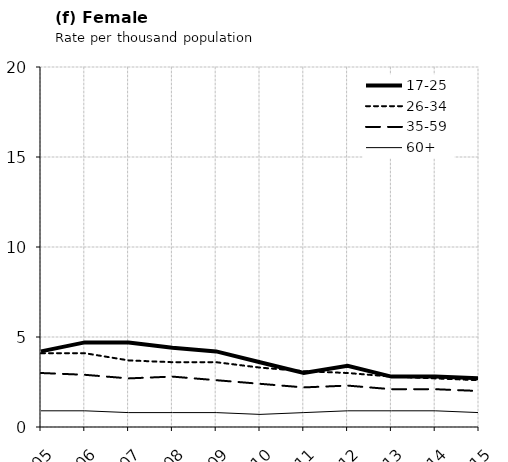
| Category | 17-25 | 26-34 | 35-59 | 60+ |
|---|---|---|---|---|
| 2005.0 | 4.2 | 4.1 | 3 | 0.9 |
| 2006.0 | 4.7 | 4.1 | 2.9 | 0.9 |
| 2007.0 | 4.7 | 3.7 | 2.7 | 0.8 |
| 2008.0 | 4.4 | 3.6 | 2.8 | 0.8 |
| 2009.0 | 4.2 | 3.6 | 2.6 | 0.8 |
| 2010.0 | 3.6 | 3.3 | 2.4 | 0.7 |
| 2011.0 | 3 | 3.1 | 2.2 | 0.8 |
| 2012.0 | 3.4 | 3 | 2.3 | 0.9 |
| 2013.0 | 2.8 | 2.8 | 2.1 | 0.9 |
| 2014.0 | 2.8 | 2.7 | 2.1 | 0.9 |
| 2015.0 | 2.7 | 2.6 | 2 | 0.8 |